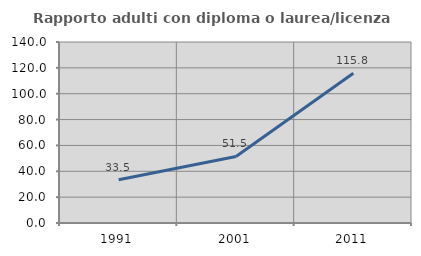
| Category | Rapporto adulti con diploma o laurea/licenza media  |
|---|---|
| 1991.0 | 33.494 |
| 2001.0 | 51.475 |
| 2011.0 | 115.809 |